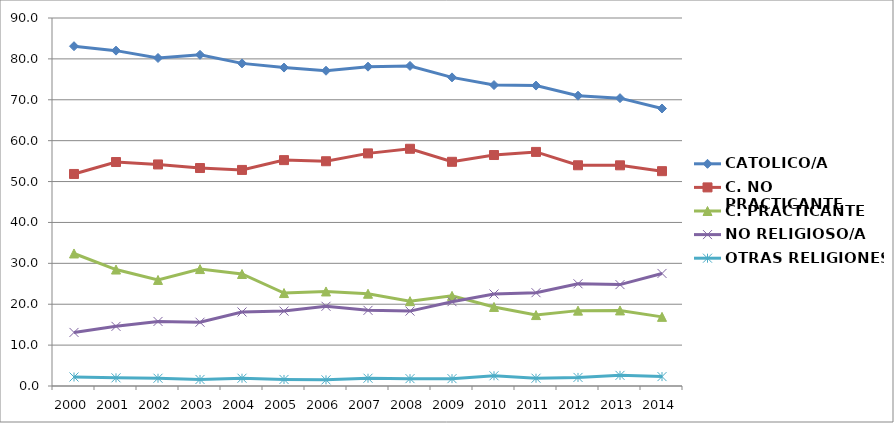
| Category | CATOLICO/A | C. NO PRACTICANTE | C. PRACTICANTE | NO RELIGIOSO/A | OTRAS RELIGIONES |
|---|---|---|---|---|---|
| 2000.0 | 83.1 | 51.856 | 32.41 | 13.1 | 2.2 |
| 2001.0 | 82.018 | 54.778 | 28.481 | 14.585 | 1.998 |
| 2002.0 | 80.22 | 54.183 | 25.942 | 15.784 | 1.898 |
| 2003.0 | 81 | 53.311 | 28.598 | 15.6 | 1.6 |
| 2004.0 | 78.9 | 52.841 | 27.39 | 18.1 | 1.9 |
| 2005.0 | 77.878 | 55.242 | 22.733 | 18.318 | 1.602 |
| 2006.0 | 77.1 | 54.968 | 23.119 | 19.5 | 1.5 |
| 2007.0 | 78.1 | 56.892 | 22.565 | 18.5 | 1.9 |
| 2008.0 | 78.278 | 58.019 | 20.755 | 18.318 | 1.802 |
| 2009.0 | 75.475 | 54.832 | 22.041 | 20.621 | 1.802 |
| 2010.0 | 73.6 | 56.488 | 19.337 | 22.5 | 2.5 |
| 2011.0 | 73.473 | 57.25 | 17.348 | 22.823 | 1.902 |
| 2012.0 | 71 | 53.981 | 18.433 | 25 | 2.1 |
| 2013.0 | 70.4 | 53.972 | 18.477 | 24.8 | 2.6 |
| 2014.0 | 67.868 | 52.543 | 16.906 | 27.528 | 2.302 |